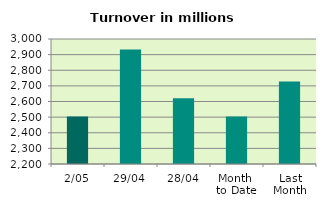
| Category | Series 0 |
|---|---|
| 2/05 | 2504.432 |
| 29/04 | 2933.282 |
| 28/04 | 2620.443 |
| Month 
to Date | 2504.432 |
| Last
Month | 2727.753 |